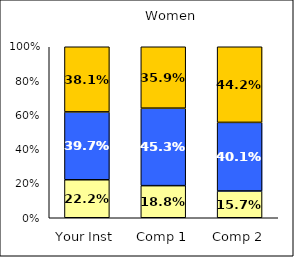
| Category | Low Scholarly Productivity | Average Scholarly Productivity | High Scholarly Productivity |
|---|---|---|---|
| Your Inst | 0.222 | 0.397 | 0.381 |
| Comp 1 | 0.188 | 0.453 | 0.359 |
| Comp 2 | 0.157 | 0.401 | 0.442 |